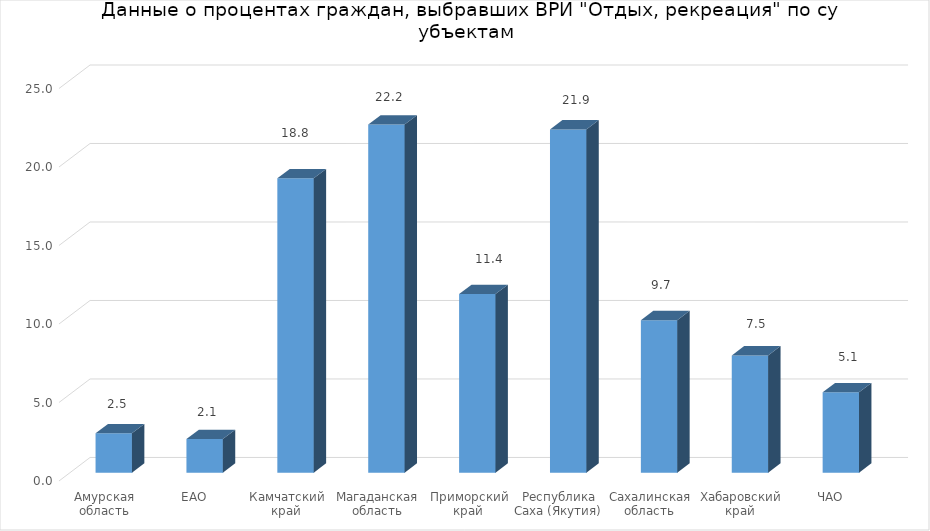
| Category | отдых, рекреация |
|---|---|
| Амурская область | 2.506 |
| ЕАО | 2.143 |
| Камчатский край | 18.75 |
| Магаданская область | 22.175 |
| Приморский край | 11.376 |
| Республика Саха (Якутия) | 21.869 |
| Сахалинская область | 9.715 |
| Хабаровский край | 7.466 |
| ЧАО | 5.118 |